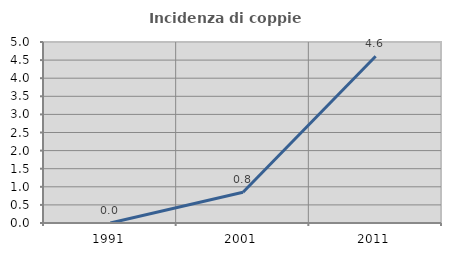
| Category | Incidenza di coppie miste |
|---|---|
| 1991.0 | 0 |
| 2001.0 | 0.847 |
| 2011.0 | 4.608 |